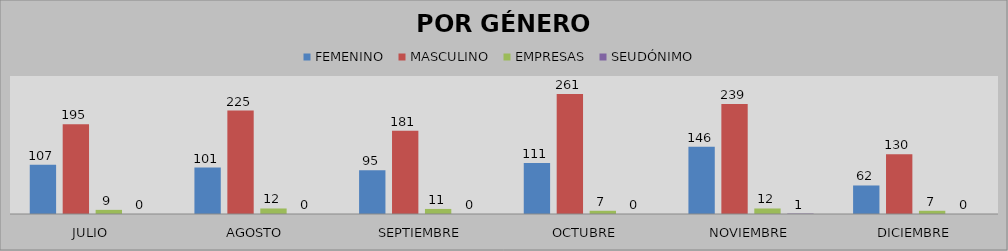
| Category | FEMENINO | MASCULINO | EMPRESAS | SEUDÓNIMO |
|---|---|---|---|---|
| JULIO | 107 | 195 | 9 | 0 |
| AGOSTO | 101 | 225 | 12 | 0 |
| SEPTIEMBRE | 95 | 181 | 11 | 0 |
| OCTUBRE | 111 | 261 | 7 | 0 |
| NOVIEMBRE | 146 | 239 | 12 | 1 |
| DICIEMBRE | 62 | 130 | 7 | 0 |